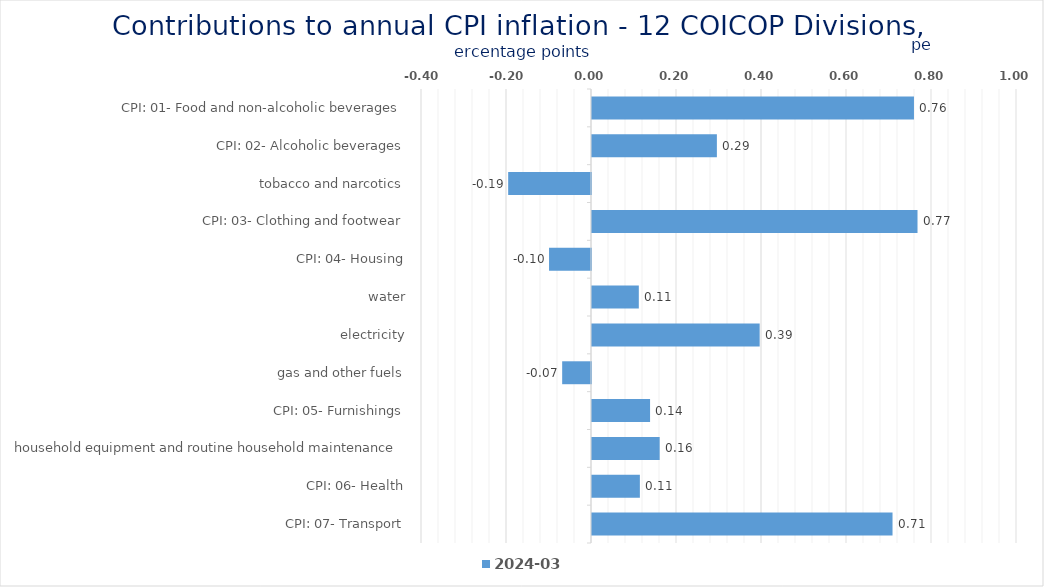
| Category | 2024-03 |
|---|---|
| CPI: 01- Food and non-alcoholic beverages | 0.758 |
| CPI: 02- Alcoholic beverages, tobacco and narcotics | 0.294 |
| CPI: 03- Clothing and footwear | -0.195 |
| CPI: 04- Housing, water, electricity, gas and other fuels | 0.766 |
| CPI: 05- Furnishings, household equipment and routine household maintenance | -0.099 |
| CPI: 06- Health | 0.11 |
| CPI: 07- Transport | 0.395 |
| CPI: 08- Communication | -0.068 |
| CPI: 09- Recreation and culture | 0.137 |
| CPI: 10- Education | 0.159 |
| CPI: 11- Restaurants and hotels | 0.113 |
| CPI: 12- Miscellaneous goods and services | 0.707 |